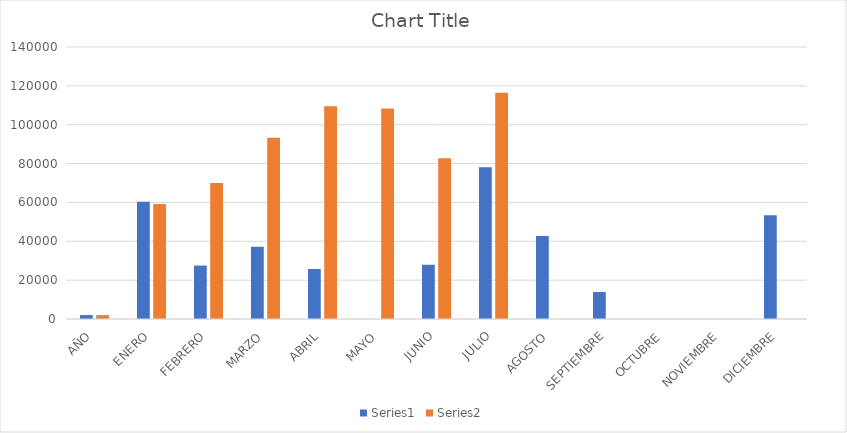
| Category | Series 0 | Series 1 |
|---|---|---|
| AÑO | 2021 | 2022 |
| ENERO | 60410 | 59160 |
| FEBRERO | 27490 | 70030 |
| MARZO | 37200 | 93230 |
| ABRIL | 25749 | 109470 |
| MAYO | 0 | 108310 |
| JUNIO | 27920 | 82790 |
| JULIO | 78068 | 116430 |
| AGOSTO | 42768 | 0 |
| SEPTIEMBRE | 13920 | 0 |
| OCTUBRE | 0 | 0 |
| NOVIEMBRE | 0 | 0 |
| DICIEMBRE | 53360 | 0 |